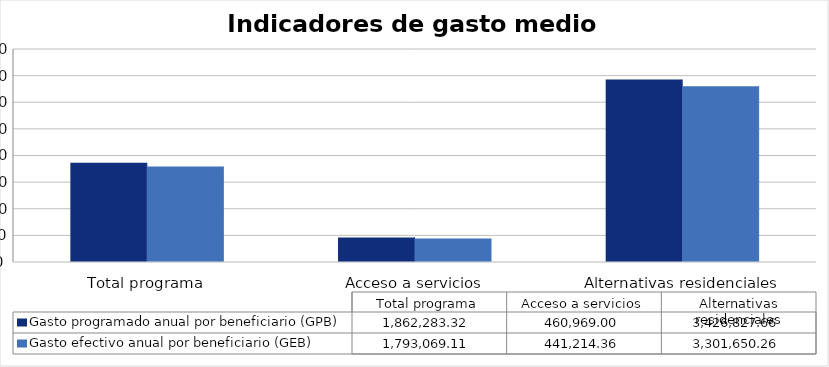
| Category | Gasto programado anual por beneficiario (GPB)  | Gasto efectivo anual por beneficiario (GEB)  |
|---|---|---|
| Total programa | 1862283.324 | 1793069.106 |
| Acceso a servicios | 460969.002 | 441214.359 |
| Alternativas residenciales | 3426827.665 | 3301650.265 |